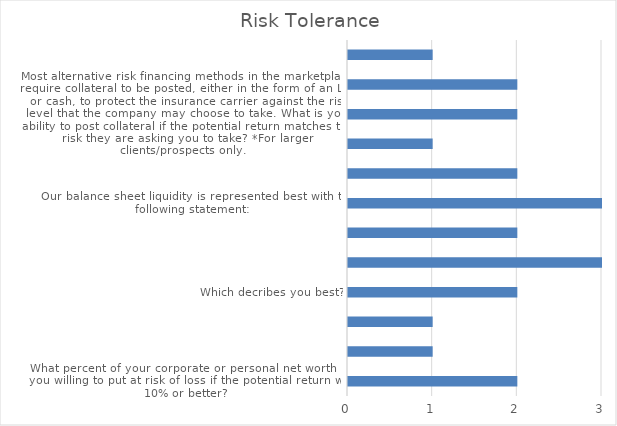
| Category | Series 0 |
|---|---|
| What percent of your corporate or personal net worth are you willing to put at risk of loss if the potential return was 10% or better? | 2 |
| On a scale of 1-10, 10 being high risk taker and 1 being very low risk taker, where do you rank yourself and why? | 1 |
| As an investor, how would you describe your portfolio?  Balanced, aggressive, conservative? | 1 |
| Which decribes you best? | 2 |
| Which decribes your net worth the best? | 3 |
| How well do you manage risk? (Choose) | 2 |
| Our balance sheet liquidity is represented best with the following statement: | 3 |
| If you could obtain a substantial decrease in your premium in return for your having a higher deductible, would it interest you? | 2 |
| Will your credit rating increase if you had higher liability due to higher deductibles or self insurance liability? | 1 |
| Most alternative risk financing methods in the marketplace require collateral to be posted, either in the form of an LOC or cash, to protect the insurance carrier against the risk level that the company may choose to take. What is your ability to post coll | 2 |
| Small client:  If you would have traded higher deductibles for lower premiums over the past 5 years, would have have lost or won that bet?                                                                    Large Client:  Looking at your past 5 years of ins | 2 |
| How inexpensive are premiums to finance risk in this Industry class?  Probably an answer for Producer. | 1 |